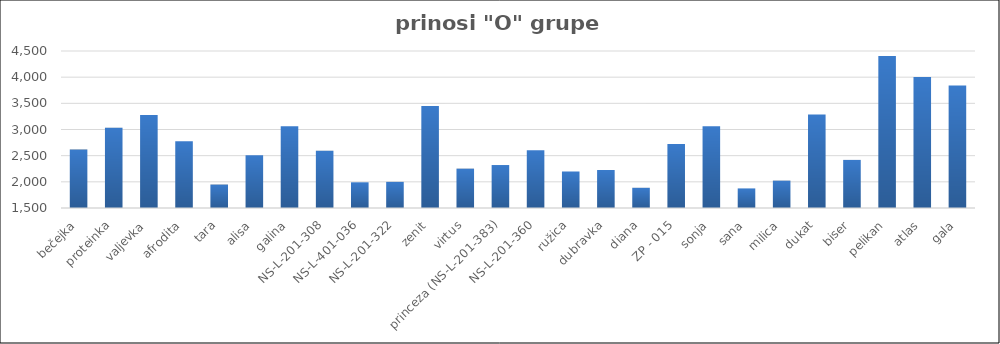
| Category | Series 0 |
|---|---|
| bečejka | 2615.836 |
| proteinka | 3033 |
| valjevka | 3274.847 |
| afrodita | 2776.475 |
| tara | 1948.067 |
| alisa | 2509.4 |
| galina | 3063.676 |
| NS-L-201-308 | 2595.6 |
| NS-L-401-036 | 1991 |
| NS-L-201-322 | 1999.275 |
| zenit | 3450.5 |
| virtus | 2252 |
| princeza (NS-L-201-383) | 2321 |
| NS-L-201-360 | 2602 |
| ružica | 2197.71 |
| dubravka | 2225.87 |
| diana | 1886.2 |
| ZP - 015 | 2723.6 |
| sonja | 3063.06 |
| sana | 1874.34 |
| milica | 2022.993 |
| dukat | 3286.674 |
| biser | 2419 |
| pelikan | 4406 |
| atlas | 4004.554 |
| gala | 3842.765 |